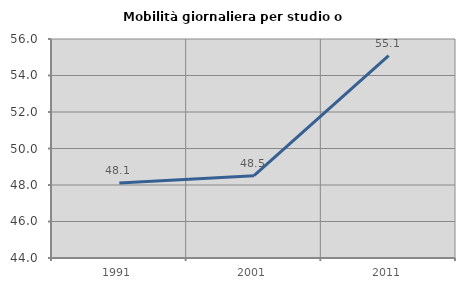
| Category | Mobilità giornaliera per studio o lavoro |
|---|---|
| 1991.0 | 48.112 |
| 2001.0 | 48.507 |
| 2011.0 | 55.093 |